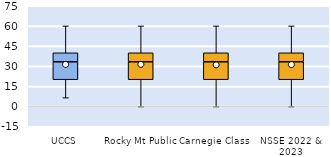
| Category | 25th | 50th | 75th |
|---|---|---|---|
| UCCS | 20 | 13.333 | 6.667 |
| Rocky Mt Public | 20 | 13.333 | 6.667 |
| Carnegie Class | 20 | 13.333 | 6.667 |
| NSSE 2022 & 2023 | 20 | 13.333 | 6.667 |